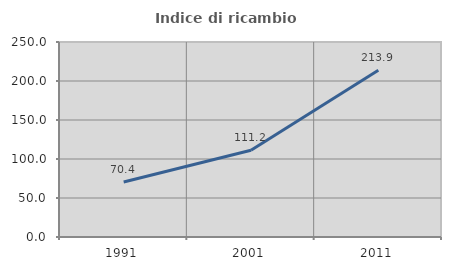
| Category | Indice di ricambio occupazionale  |
|---|---|
| 1991.0 | 70.433 |
| 2001.0 | 111.213 |
| 2011.0 | 213.864 |